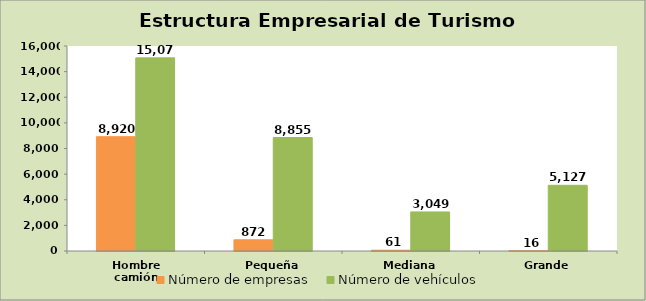
| Category | Número de empresas | Número de vehículos |
|---|---|---|
| Hombre camión | 8920 | 15074 |
| Pequeña | 872 | 8855 |
| Mediana | 61 | 3049 |
| Grande | 16 | 5127 |